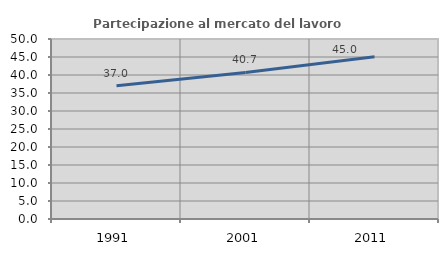
| Category | Partecipazione al mercato del lavoro  femminile |
|---|---|
| 1991.0 | 36.991 |
| 2001.0 | 40.707 |
| 2011.0 | 45.046 |